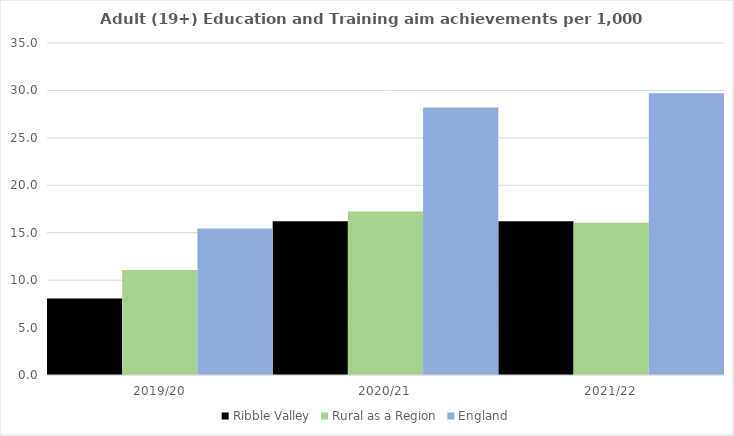
| Category | Ribble Valley | Rural as a Region | England |
|---|---|---|---|
| 2019/20 | 8.065 | 11.081 | 15.446 |
| 2020/21 | 16.197 | 17.224 | 28.211 |
| 2021/22 | 16.205 | 16.063 | 29.711 |